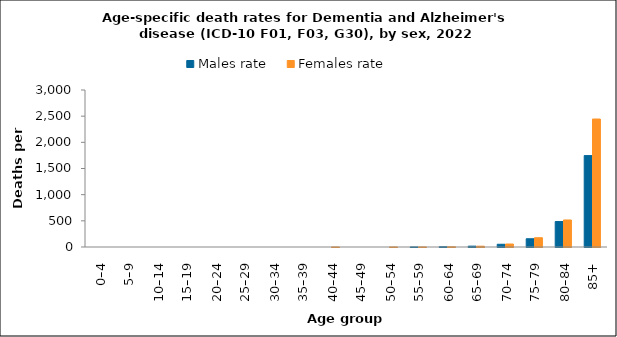
| Category | Males rate | Females rate |
|---|---|---|
| 0–4 | 0 | 0 |
| 5–9 | 0 | 0 |
| 10–14 | 0 | 0 |
| 15–19 | 0 | 0 |
| 20–24 | 0 | 0 |
| 25–29 | 0 | 0 |
| 30–34 | 0 | 0 |
| 35–39 | 0 | 0 |
| 40–44 | 0 | 0.116 |
| 45–49 | 0 | 0 |
| 50–54 | 0 | 0.595 |
| 55–59 | 1.193 | 1.153 |
| 60–64 | 4.824 | 4.433 |
| 65–69 | 16.26 | 15.393 |
| 70–74 | 52.253 | 57.096 |
| 75–79 | 157.88 | 177.245 |
| 80–84 | 486.388 | 516.405 |
| 85+ | 1746.371 | 2445.384 |